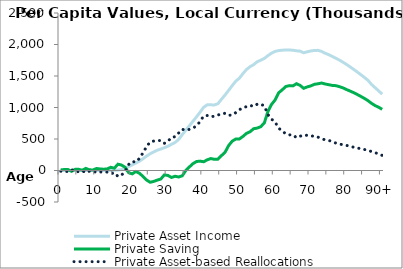
| Category | Private Asset Income | Private Saving | Private Asset-based Reallocations |
|---|---|---|---|
| 0 | 0 | 11394.585 | -11394.585 |
|  | 0 | 14827.843 | -14827.843 |
| 2 | 0 | 16493.78 | -16493.78 |
| 3 | 0 | -13204.009 | 13204.009 |
| 4 | 0 | 18246.841 | -18246.841 |
| 5 | 0 | 18395.392 | -18395.392 |
| 6 | 0 | 4794.638 | -4794.638 |
| 7 | 0 | 33828.862 | -33828.862 |
| 8 | 0 | 11495.263 | -11495.263 |
| 9 | 0 | 7717.769 | -7717.769 |
| 10 | 0 | 31767.67 | -31767.67 |
| 11 | 0 | 24402.013 | -24402.013 |
| 12 | 6.099 | 20318.656 | -20312.557 |
| 13 | 31.484 | 25795.126 | -25763.642 |
| 14 | 82.322 | 50883.947 | -50801.626 |
| 15 | 2280.738 | 36677.992 | -34397.255 |
| 16 | 6285.982 | 99896.517 | -93610.534 |
| 17 | 14246.18 | 86651.354 | -72405.174 |
| 18 | 33489.901 | 51576.152 | -18086.25 |
| 19 | 60910.724 | -34645.438 | 95556.162 |
| 20 | 89365.433 | -53185.426 | 142550.86 |
| 21 | 117918.87 | -16424.61 | 134343.48 |
| 22 | 147546.301 | -43287.039 | 190833.341 |
| 23 | 185072.141 | -92785.3 | 277857.441 |
| 24 | 227715.79 | -149689.688 | 377405.478 |
| 25 | 264732.454 | -186504.063 | 451236.517 |
| 26 | 293611.761 | -173768.256 | 467380.017 |
| 27 | 321106.765 | -152937.781 | 474044.546 |
| 28 | 341105.983 | -135394.731 | 476500.714 |
| 29 | 361697.516 | -70092.054 | 431789.57 |
| 30 | 384717.041 | -78626.6 | 463343.642 |
| 31 | 415799.688 | -110397.587 | 526197.275 |
| 32 | 444861.14 | -91267.173 | 536128.313 |
| 33 | 492232.898 | -102954.577 | 595187.475 |
| 34 | 568770.679 | -84970.492 | 653741.171 |
| 35 | 639209.391 | -351.462 | 639560.853 |
| 36 | 709159.569 | 56339.022 | 652820.547 |
| 37 | 780521.335 | 107988.201 | 672533.135 |
| 38 | 851098.993 | 142443.82 | 708655.173 |
| 39 | 925241.389 | 148685.605 | 776555.784 |
| 40 | 1003765.565 | 138926.047 | 864839.519 |
| 41 | 1042256.33 | 169490.346 | 872765.984 |
| 42 | 1042116.777 | 189706.526 | 852410.251 |
| 43 | 1040649.237 | 177588.924 | 863060.312 |
| 44 | 1060458.313 | 179478.615 | 880979.698 |
| 45 | 1130779.319 | 236576.235 | 894203.084 |
| 46 | 1198873.678 | 290067.296 | 908806.381 |
| 47 | 1272065.658 | 396078.796 | 875986.862 |
| 48 | 1347545.739 | 465900.316 | 881645.423 |
| 49 | 1417990.798 | 499278.999 | 918711.799 |
| 50 | 1464706.928 | 500062.547 | 964644.381 |
| 51 | 1537594.527 | 540594.361 | 997000.166 |
| 52 | 1603082.344 | 589534.842 | 1013547.501 |
| 53 | 1648156.187 | 615343.742 | 1032812.446 |
| 54 | 1680131.835 | 662961.287 | 1017170.549 |
| 55 | 1726139.744 | 673364.066 | 1052775.678 |
| 56 | 1750680.925 | 696005.488 | 1054675.438 |
| 57 | 1779102.208 | 756523.083 | 1022579.125 |
| 58 | 1823567.046 | 936577.538 | 886989.509 |
| 59 | 1862789.451 | 1048133.804 | 814655.647 |
| 60 | 1889761.779 | 1119278.434 | 770483.344 |
| 61 | 1903764.675 | 1232854.416 | 670910.258 |
| 62 | 1908933.639 | 1280469.164 | 628464.475 |
| 63 | 1913660.89 | 1333008.947 | 580651.944 |
| 64 | 1912547.176 | 1347169.565 | 565377.612 |
| 65 | 1909125.927 | 1343150.101 | 565975.826 |
| 66 | 1899399.175 | 1378131.579 | 521267.597 |
| 67 | 1894591.842 | 1351082.919 | 543508.924 |
| 68 | 1868356.802 | 1304621.929 | 563734.873 |
| 69 | 1884028.615 | 1326834.292 | 557194.323 |
| 70 | 1897292.635 | 1342841.69 | 554450.945 |
| 71 | 1905653.213 | 1367639.983 | 538013.23 |
| 72 | 1906985.888 | 1376652.742 | 530333.146 |
| 73 | 1890727.339 | 1388389.639 | 502337.7 |
| 74 | 1862181.18 | 1373803.78 | 488377.4 |
| 75 | 1839163.674 | 1361942.312 | 477221.362 |
| 76 | 1810832.764 | 1350871.883 | 459960.881 |
| 77 | 1781905.575 | 1346687.552 | 435218.024 |
| 78 | 1753005.066 | 1331543.604 | 421461.463 |
| 79 | 1719151.376 | 1311751.166 | 407400.21 |
| 80 | 1683671.864 | 1285172.61 | 398499.254 |
| 81 | 1645031.263 | 1261101.779 | 383929.484 |
| 82 | 1605133.798 | 1235695.443 | 369438.354 |
| 83 | 1564103.629 | 1206892.049 | 357211.58 |
| 84 | 1521764.716 | 1176545.113 | 345219.603 |
| 85 | 1477988.406 | 1144788.212 | 333200.194 |
| 86 | 1432211.515 | 1109434.321 | 322777.194 |
| 87 | 1366614.339 | 1066315.244 | 300299.095 |
| 88 | 1314916.15 | 1030542.051 | 284374.099 |
| 89 | 1263947.351 | 1004136.432 | 259810.92 |
| 90+ | 1210938.281 | 970958.351 | 239979.93 |